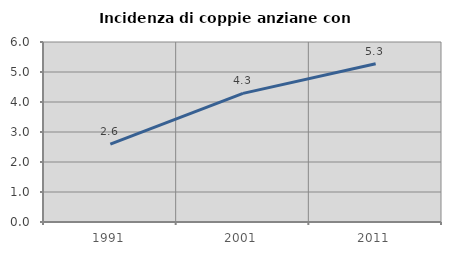
| Category | Incidenza di coppie anziane con figli |
|---|---|
| 1991.0 | 2.595 |
| 2001.0 | 4.288 |
| 2011.0 | 5.276 |